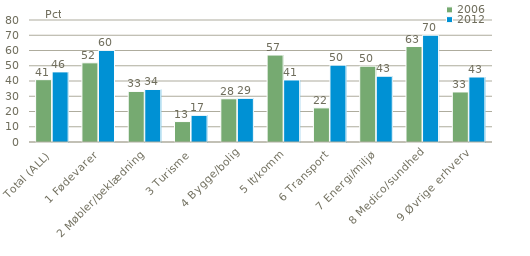
| Category | 2006 | 2012 |
|---|---|---|
| Total (ALL) | 40.877 | 45.978 |
| 1 Fødevarer | 51.926 | 60.077 |
| 2 Møbler/beklædning | 33.164 | 34.443 |
| 3 Turisme | 13.395 | 17.487 |
| 4 Bygge/bolig | 28.345 | 28.63 |
| 5 It/komm | 57.014 | 40.67 |
| 6 Transport | 22.376 | 50.406 |
| 7 Energi/miljø | 49.739 | 43.134 |
| 8 Medico/sundhed | 62.604 | 70.023 |
| 9 Øvrige erhverv | 32.809 | 42.622 |